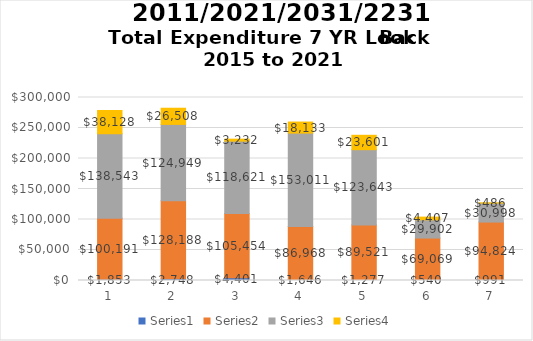
| Category | Series 0 | Series 1 | Series 2 | Series 3 |
|---|---|---|---|---|
| 0 | 1853 | 100191 | 138543 | 38128 |
| 1 | 2748 | 128188 | 124949 | 26508 |
| 2 | 4401 | 105454 | 118621 | 3232 |
| 3 | 1646 | 86968 | 153011 | 18133 |
| 4 | 1277 | 89521 | 123643 | 23601 |
| 5 | 540 | 69069 | 29902 | 4407 |
| 6 | 991 | 94824 | 30998 | 486 |